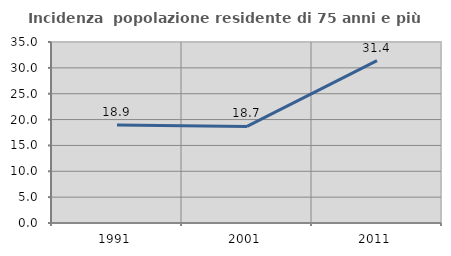
| Category | Incidenza  popolazione residente di 75 anni e più |
|---|---|
| 1991.0 | 18.932 |
| 2001.0 | 18.675 |
| 2011.0 | 31.405 |